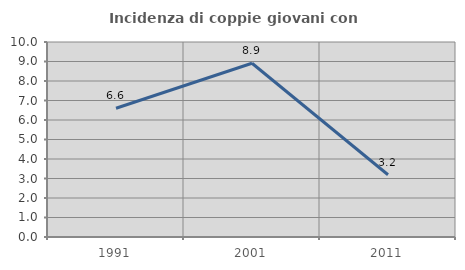
| Category | Incidenza di coppie giovani con figli |
|---|---|
| 1991.0 | 6.604 |
| 2001.0 | 8.911 |
| 2011.0 | 3.191 |